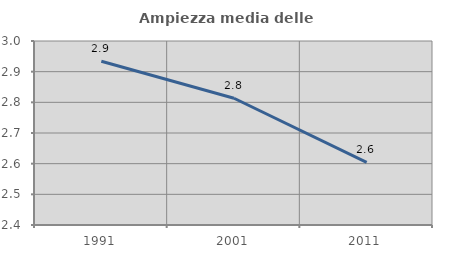
| Category | Ampiezza media delle famiglie |
|---|---|
| 1991.0 | 2.934 |
| 2001.0 | 2.813 |
| 2011.0 | 2.605 |